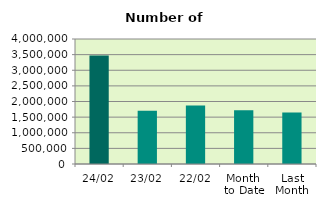
| Category | Series 0 |
|---|---|
| 24/02 | 3468996 |
| 23/02 | 1707846 |
| 22/02 | 1874126 |
| Month 
to Date | 1718132 |
| Last
Month | 1644892 |